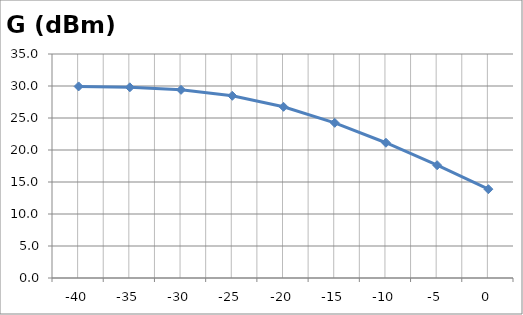
| Category | G (dBm) |
|---|---|
| -40.0 | 29.932 |
| -35.0 | 29.793 |
| -30.0 | 29.401 |
| -25.0 | 28.471 |
| -20.0 | 26.75 |
| -15.0 | 24.242 |
| -10.0 | 21.133 |
| -5.0 | 17.624 |
| 0.0 | 13.878 |